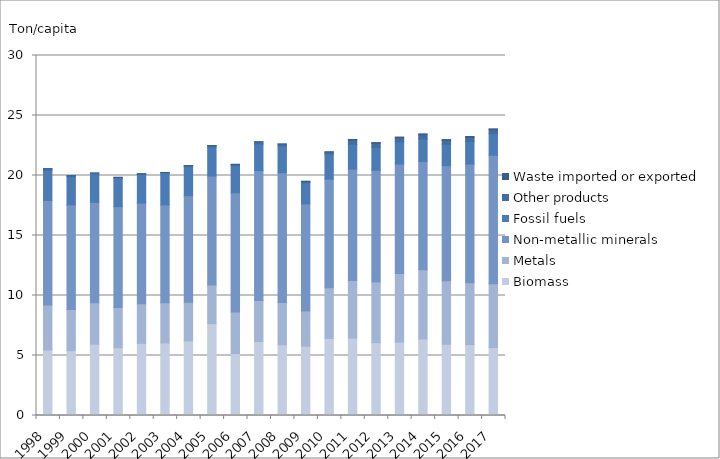
| Category | Biomass | Metals | Non-metallic minerals | Fossil fuels | Other products | Waste imported or exported |
|---|---|---|---|---|---|---|
| 1998.0 | 5.461 | 3.741 | 8.723 | 2.519 | 0.122 | 0 |
| 1999.0 | 5.407 | 3.428 | 8.719 | 2.34 | 0.088 | 0 |
| 2000.0 | 5.943 | 3.462 | 8.355 | 2.372 | 0.099 | 0 |
| 2001.0 | 5.643 | 3.365 | 8.401 | 2.374 | 0.062 | 0 |
| 2002.0 | 6.012 | 3.291 | 8.398 | 2.382 | 0.059 | 0 |
| 2003.0 | 6.044 | 3.362 | 8.144 | 2.651 | 0.053 | 0 |
| 2004.0 | 6.218 | 3.218 | 8.883 | 2.423 | 0.078 | 0 |
| 2005.0 | 7.659 | 3.218 | 9.077 | 2.418 | 0.122 | 0.002 |
| 2006.0 | 5.161 | 3.471 | 9.93 | 2.256 | 0.11 | 0.001 |
| 2007.0 | 6.17 | 3.406 | 10.832 | 2.219 | 0.177 | 0.001 |
| 2008.0 | 5.894 | 3.517 | 10.817 | 2.227 | 0.166 | 0.003 |
| 2009.0 | 5.778 | 2.934 | 8.921 | 1.764 | 0.11 | 0.017 |
| 2010.0 | 6.423 | 4.221 | 9.051 | 2.085 | 0.167 | 0.031 |
| 2011.0 | 6.45 | 4.806 | 9.27 | 2.071 | 0.357 | 0.049 |
| 2012.0 | 6.075 | 5.049 | 9.31 | 1.912 | 0.341 | 0.056 |
| 2013.0 | 6.12 | 5.704 | 9.13 | 1.845 | 0.346 | 0.058 |
| 2014.0 | 6.371 | 5.773 | 9.03 | 1.866 | 0.36 | 0.068 |
| 2015.0 | 5.936 | 5.292 | 9.593 | 1.781 | 0.324 | 0.068 |
| 2016.0 | 5.912 | 5.153 | 9.889 | 1.887 | 0.338 | 0.071 |
| 2017.0 | 5.661 | 5.325 | 10.7 | 1.805 | 0.323 | 0.075 |